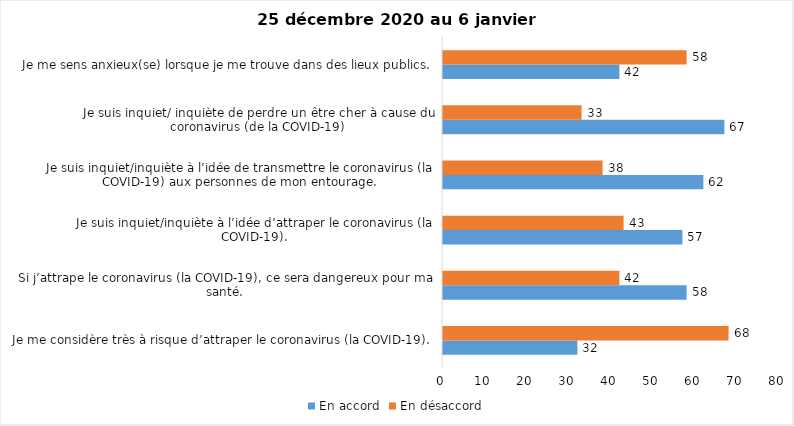
| Category | En accord | En désaccord |
|---|---|---|
| Je me considère très à risque d’attraper le coronavirus (la COVID-19). | 32 | 68 |
| Si j’attrape le coronavirus (la COVID-19), ce sera dangereux pour ma santé. | 58 | 42 |
| Je suis inquiet/inquiète à l’idée d’attraper le coronavirus (la COVID-19). | 57 | 43 |
| Je suis inquiet/inquiète à l’idée de transmettre le coronavirus (la COVID-19) aux personnes de mon entourage. | 62 | 38 |
| Je suis inquiet/ inquiète de perdre un être cher à cause du coronavirus (de la COVID-19) | 67 | 33 |
| Je me sens anxieux(se) lorsque je me trouve dans des lieux publics. | 42 | 58 |